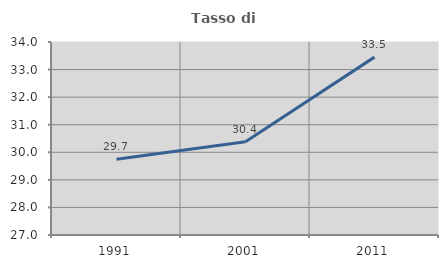
| Category | Tasso di occupazione   |
|---|---|
| 1991.0 | 29.749 |
| 2001.0 | 30.378 |
| 2011.0 | 33.452 |